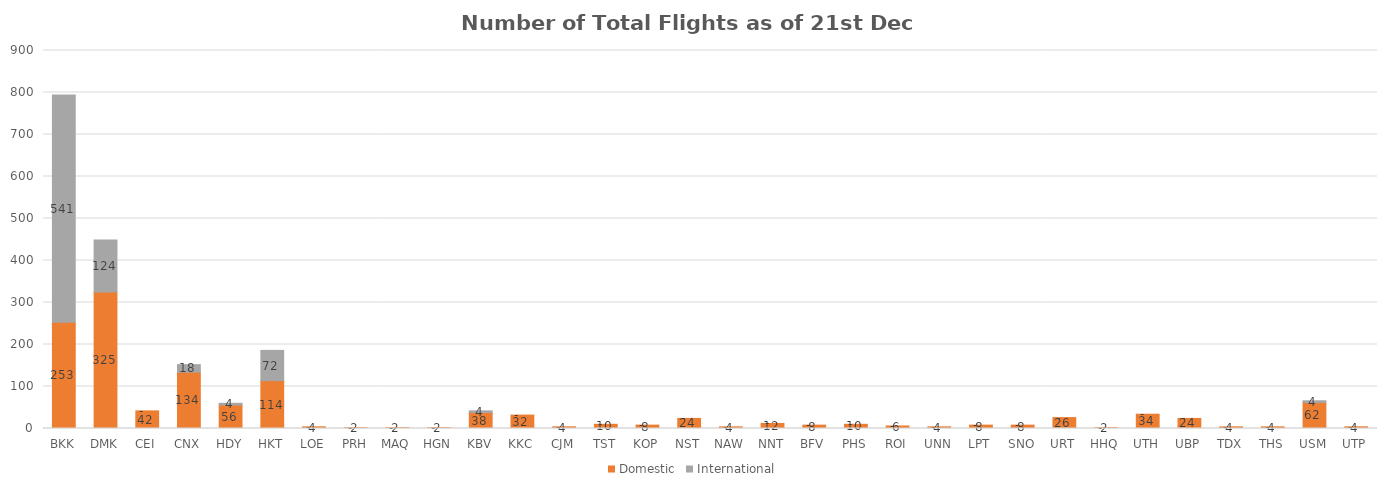
| Category | Domestic | International |
|---|---|---|
| BKK | 253 | 541 |
| DMK | 325 | 124 |
| CEI | 42 | 0 |
| CNX | 134 | 18 |
| HDY | 56 | 4 |
| HKT | 114 | 72 |
| LOE | 4 | 0 |
| PRH | 2 | 0 |
| MAQ | 2 | 0 |
| HGN | 2 | 0 |
| KBV | 38 | 4 |
| KKC | 32 | 0 |
| CJM | 4 | 0 |
| TST | 10 | 0 |
| KOP | 8 | 0 |
| NST | 24 | 0 |
| NAW | 4 | 0 |
| NNT | 12 | 0 |
| BFV | 8 | 0 |
| PHS | 10 | 0 |
| ROI | 6 | 0 |
| UNN | 4 | 0 |
| LPT | 8 | 0 |
| SNO | 8 | 0 |
| URT | 26 | 0 |
| HHQ | 2 | 0 |
| UTH | 34 | 0 |
| UBP | 24 | 0 |
| TDX | 4 | 0 |
| THS | 4 | 0 |
| USM | 62 | 4 |
| UTP | 4 | 0 |